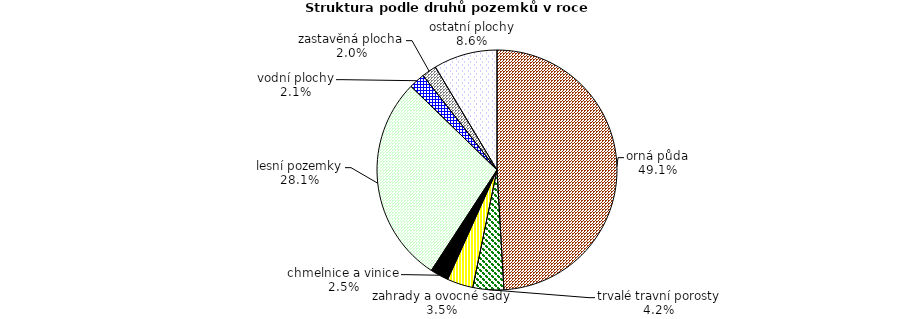
| Category | Struktura druhů pozemků |
|---|---|
| orná půda | 353116.229 |
| trvalé travní porosty | 29915.913 |
| zahrady a ovocné sady | 25186.623 |
| chmelnice a vinice | 17822.01 |
| lesní pozemky | 201898.168 |
| vodní plochy | 15525.648 |
| zastavěná plocha | 14268.732 |
| ostatní plochy | 61756.138 |